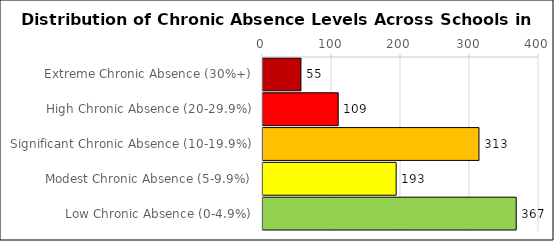
| Category | Number of Schools |
|---|---|
| Extreme Chronic Absence (30%+) | 55 |
| High Chronic Absence (20-29.9%) | 109 |
| Significant Chronic Absence (10-19.9%) | 313 |
| Modest Chronic Absence (5-9.9%) | 193 |
| Low Chronic Absence (0-4.9%) | 367 |